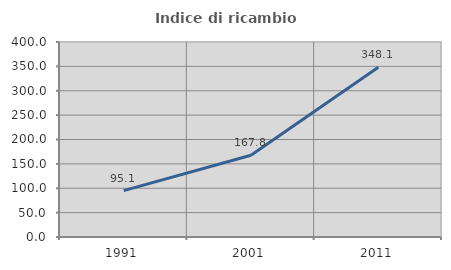
| Category | Indice di ricambio occupazionale  |
|---|---|
| 1991.0 | 95.139 |
| 2001.0 | 167.755 |
| 2011.0 | 348.128 |